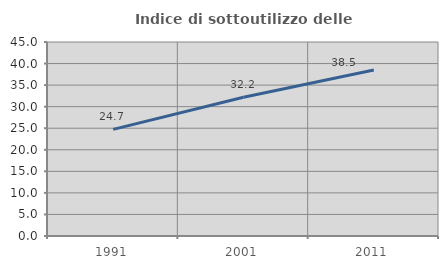
| Category | Indice di sottoutilizzo delle abitazioni  |
|---|---|
| 1991.0 | 24.726 |
| 2001.0 | 32.186 |
| 2011.0 | 38.51 |